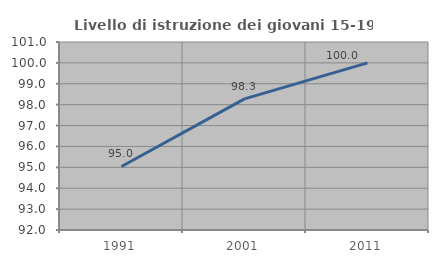
| Category | Livello di istruzione dei giovani 15-19 anni |
|---|---|
| 1991.0 | 95.041 |
| 2001.0 | 98.276 |
| 2011.0 | 100 |